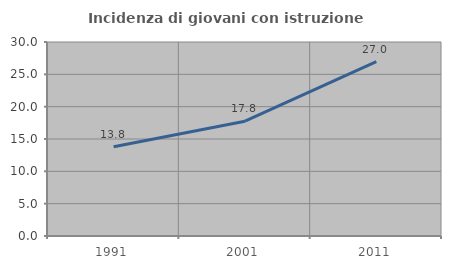
| Category | Incidenza di giovani con istruzione universitaria |
|---|---|
| 1991.0 | 13.81 |
| 2001.0 | 17.757 |
| 2011.0 | 26.97 |